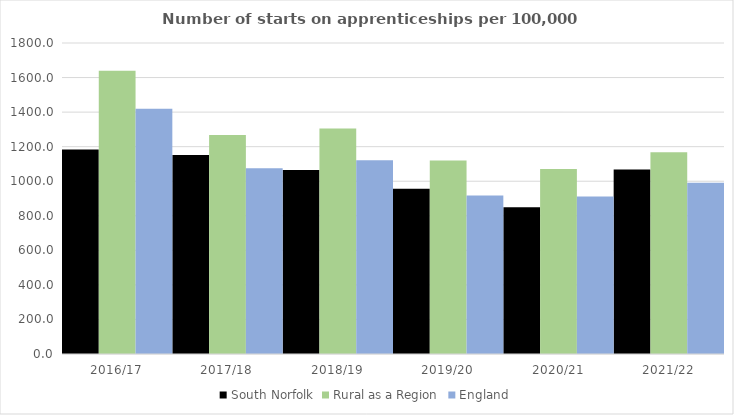
| Category | South Norfolk | Rural as a Region | England |
|---|---|---|---|
| 2016/17 | 1184 | 1638.789 | 1420 |
| 2017/18 | 1152 | 1267.474 | 1075 |
| 2018/19 | 1065 | 1304.57 | 1122 |
| 2019/20 | 956 | 1119.662 | 918 |
| 2020/21 | 850 | 1070.748 | 912 |
| 2021/22 | 1068 | 1167.68 | 991 |